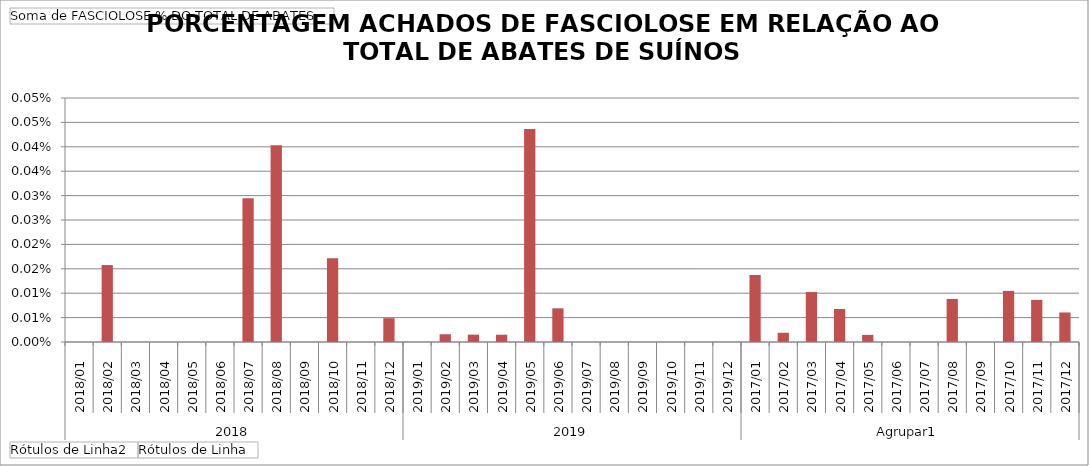
| Category | Total |
|---|---|
| 0 | 0 |
| 1 | 0 |
| 2 | 0 |
| 3 | 0 |
| 4 | 0 |
| 5 | 0 |
| 6 | 0 |
| 7 | 0 |
| 8 | 0 |
| 9 | 0 |
| 10 | 0 |
| 11 | 0 |
| 12 | 0 |
| 13 | 0 |
| 14 | 0 |
| 15 | 0 |
| 16 | 0 |
| 17 | 0 |
| 18 | 0 |
| 19 | 0 |
| 20 | 0 |
| 21 | 0 |
| 22 | 0 |
| 23 | 0 |
| 24 | 0 |
| 25 | 0 |
| 26 | 0 |
| 27 | 0 |
| 28 | 0 |
| 29 | 0 |
| 30 | 0 |
| 31 | 0 |
| 32 | 0 |
| 33 | 0 |
| 34 | 0 |
| 35 | 0 |